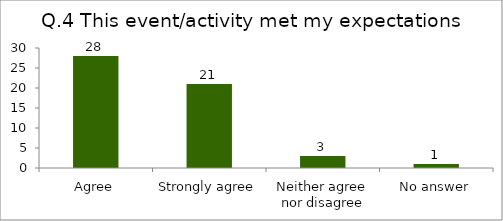
| Category | Q.4 This event/activity met my expectations |
|---|---|
| Agree | 28 |
| Strongly agree | 21 |
| Neither agree nor disagree | 3 |
| No answer | 1 |